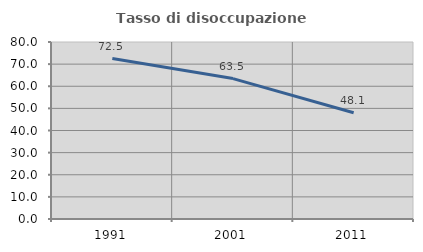
| Category | Tasso di disoccupazione giovanile  |
|---|---|
| 1991.0 | 72.521 |
| 2001.0 | 63.469 |
| 2011.0 | 48.052 |